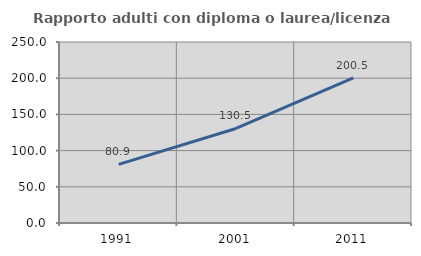
| Category | Rapporto adulti con diploma o laurea/licenza media  |
|---|---|
| 1991.0 | 80.926 |
| 2001.0 | 130.528 |
| 2011.0 | 200.504 |